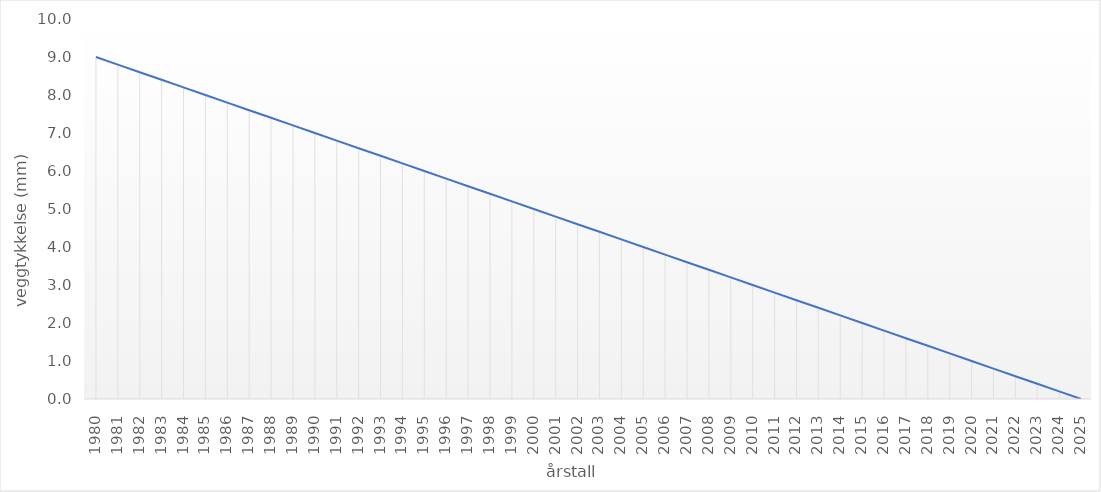
| Category | Veggtykkelse |
|---|---|
| 1980.0 | 9 |
| 1981.0 | 8.8 |
| 1982.0 | 8.6 |
| 1983.0 | 8.4 |
| 1984.0 | 8.2 |
| 1985.0 | 8 |
| 1986.0 | 7.8 |
| 1987.0 | 7.6 |
| 1988.0 | 7.4 |
| 1989.0 | 7.2 |
| 1990.0 | 7 |
| 1991.0 | 6.8 |
| 1992.0 | 6.6 |
| 1993.0 | 6.4 |
| 1994.0 | 6.2 |
| 1995.0 | 6 |
| 1996.0 | 5.8 |
| 1997.0 | 5.6 |
| 1998.0 | 5.4 |
| 1999.0 | 5.2 |
| 2000.0 | 5 |
| 2001.0 | 4.8 |
| 2002.0 | 4.6 |
| 2003.0 | 4.4 |
| 2004.0 | 4.2 |
| 2005.0 | 4 |
| 2006.0 | 3.8 |
| 2007.0 | 3.6 |
| 2008.0 | 3.4 |
| 2009.0 | 3.2 |
| 2010.0 | 3 |
| 2011.0 | 2.8 |
| 2012.0 | 2.6 |
| 2013.0 | 2.4 |
| 2014.0 | 2.2 |
| 2015.0 | 2 |
| 2016.0 | 1.8 |
| 2017.0 | 1.6 |
| 2018.0 | 1.4 |
| 2019.0 | 1.2 |
| 2020.0 | 1 |
| 2021.0 | 0.8 |
| 2022.0 | 0.6 |
| 2023.0 | 0.4 |
| 2024.0 | 0.2 |
| 2025.0 | 0 |